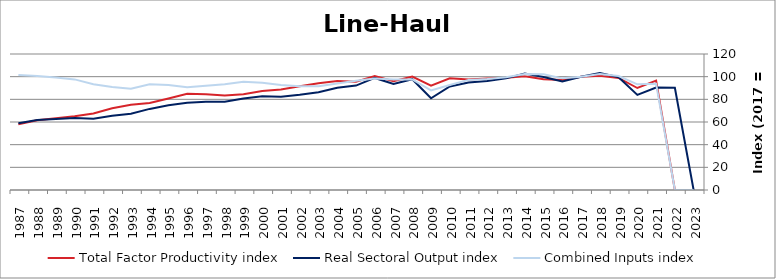
| Category | Total Factor Productivity index | Real Sectoral Output index | Combined Inputs index |
|---|---|---|---|
| 2023.0 | 0 | 0 | 0 |
| 2022.0 | 0 | 90.196 | 0 |
| 2021.0 | 96.483 | 90.429 | 93.725 |
| 2020.0 | 89.981 | 83.902 | 93.245 |
| 2019.0 | 98.919 | 99.509 | 100.597 |
| 2018.0 | 100.869 | 103.213 | 102.323 |
| 2017.0 | 100 | 100 | 100 |
| 2016.0 | 97.156 | 95.707 | 98.509 |
| 2015.0 | 97.647 | 99.702 | 102.104 |
| 2014.0 | 100.377 | 102.831 | 102.445 |
| 2013.0 | 98.941 | 98.509 | 99.563 |
| 2012.0 | 98.356 | 96.277 | 97.886 |
| 2011.0 | 97.574 | 94.788 | 97.145 |
| 2010.0 | 98.612 | 91.304 | 92.59 |
| 2009.0 | 92.102 | 80.924 | 87.863 |
| 2008.0 | 100.136 | 97.739 | 97.606 |
| 2007.0 | 96.01 | 93.507 | 97.393 |
| 2006.0 | 100.531 | 98.881 | 98.358 |
| 2005.0 | 95.517 | 92.124 | 96.447 |
| 2004.0 | 96.117 | 90.27 | 93.917 |
| 2003.0 | 94.194 | 86.251 | 91.567 |
| 2002.0 | 91.626 | 83.965 | 91.639 |
| 2001.0 | 88.748 | 82.202 | 92.624 |
| 2000.0 | 87.438 | 82.685 | 94.564 |
| 1999.0 | 84.439 | 80.722 | 95.598 |
| 1998.0 | 83.382 | 77.789 | 93.292 |
| 1997.0 | 84.495 | 77.769 | 92.04 |
| 1996.0 | 84.894 | 76.895 | 90.577 |
| 1995.0 | 80.78 | 74.819 | 92.622 |
| 1994.0 | 76.752 | 71.561 | 93.238 |
| 1993.0 | 75.16 | 67.205 | 89.416 |
| 1992.0 | 72.058 | 65.557 | 90.977 |
| 1991.0 | 67.476 | 62.954 | 93.298 |
| 1990.0 | 64.997 | 63.43 | 97.59 |
| 1989.0 | 63.245 | 62.729 | 99.185 |
| 1988.0 | 61.498 | 61.833 | 100.543 |
| 1987.0 | 57.974 | 58.869 | 101.543 |